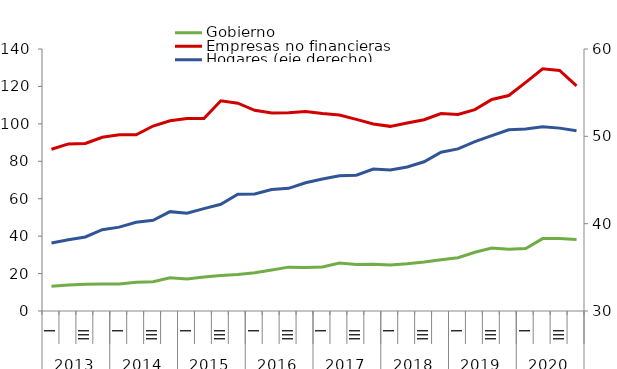
| Category | Gobierno  | Empresas no financieras  |
|---|---|---|
| 0 | 13.266 | 86.416 |
| 1 | 13.842 | 89.277 |
| 2 | 14.262 | 89.489 |
| 3 | 14.41 | 92.835 |
| 4 | 14.404 | 94.115 |
| 5 | 15.34 | 94.154 |
| 6 | 15.683 | 98.837 |
| 7 | 17.802 | 101.652 |
| 8 | 17.097 | 102.915 |
| 9 | 18.161 | 102.891 |
| 10 | 18.974 | 112.309 |
| 11 | 19.563 | 111.061 |
| 12 | 20.442 | 107.236 |
| 13 | 21.93 | 105.842 |
| 14 | 23.443 | 105.94 |
| 15 | 23.289 | 106.547 |
| 16 | 23.569 | 105.526 |
| 17 | 25.671 | 104.752 |
| 18 | 24.888 | 102.37 |
| 19 | 24.931 | 99.96 |
| 20 | 24.541 | 98.663 |
| 21 | 25.238 | 100.506 |
| 22 | 26.149 | 102.205 |
| 23 | 27.339 | 105.524 |
| 24 | 28.444 | 105.053 |
| 25 | 31.41 | 107.613 |
| 26 | 33.658 | 113.03 |
| 27 | 33.043 | 115.153 |
| 28 | 33.38 | 122.189 |
| 29 | 38.682 | 129.419 |
| 30 | 38.725 | 128.524 |
| 31 | 38.225 | 120.301 |